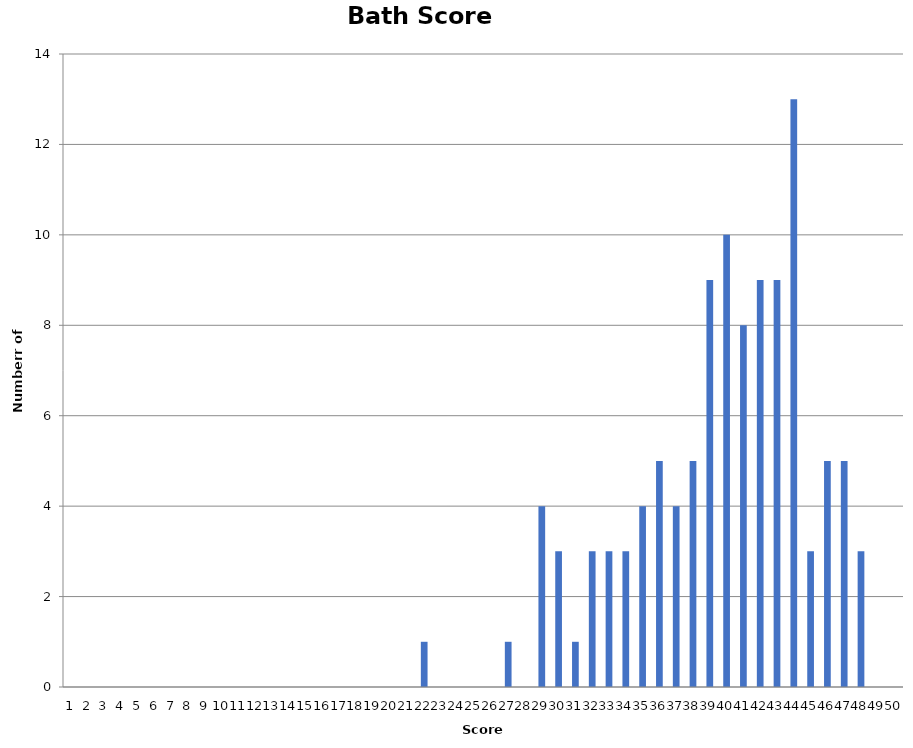
| Category | BTH |
|---|---|
| 0 | 0 |
| 1 | 0 |
| 2 | 0 |
| 3 | 0 |
| 4 | 0 |
| 5 | 0 |
| 6 | 0 |
| 7 | 0 |
| 8 | 0 |
| 9 | 0 |
| 10 | 0 |
| 11 | 0 |
| 12 | 0 |
| 13 | 0 |
| 14 | 0 |
| 15 | 0 |
| 16 | 0 |
| 17 | 0 |
| 18 | 0 |
| 19 | 0 |
| 20 | 0 |
| 21 | 1 |
| 22 | 0 |
| 23 | 0 |
| 24 | 0 |
| 25 | 0 |
| 26 | 1 |
| 27 | 0 |
| 28 | 4 |
| 29 | 3 |
| 30 | 1 |
| 31 | 3 |
| 32 | 3 |
| 33 | 3 |
| 34 | 4 |
| 35 | 5 |
| 36 | 4 |
| 37 | 5 |
| 38 | 9 |
| 39 | 10 |
| 40 | 8 |
| 41 | 9 |
| 42 | 9 |
| 43 | 13 |
| 44 | 3 |
| 45 | 5 |
| 46 | 5 |
| 47 | 3 |
| 48 | 0 |
| 49 | 0 |